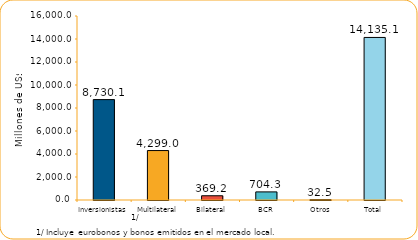
| Category | Series 1 |
|---|---|
| Inversionistas | 8730.1 |
| Multilateral | 4299 |
| Bilateral | 369.2 |
| BCR | 704.3 |
| Otros | 32.5 |
| Total | 14135.1 |